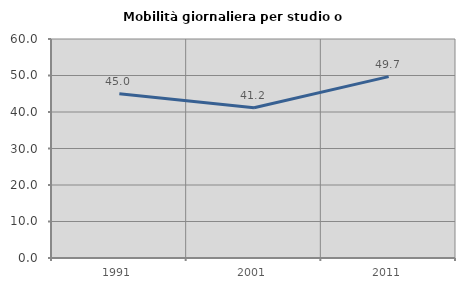
| Category | Mobilità giornaliera per studio o lavoro |
|---|---|
| 1991.0 | 44.997 |
| 2001.0 | 41.158 |
| 2011.0 | 49.695 |